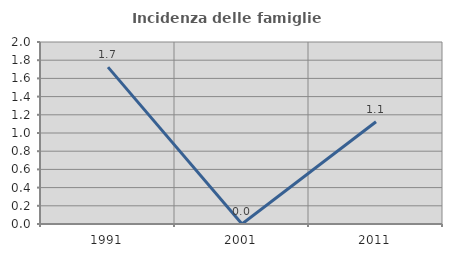
| Category | Incidenza delle famiglie numerose |
|---|---|
| 1991.0 | 1.724 |
| 2001.0 | 0 |
| 2011.0 | 1.124 |